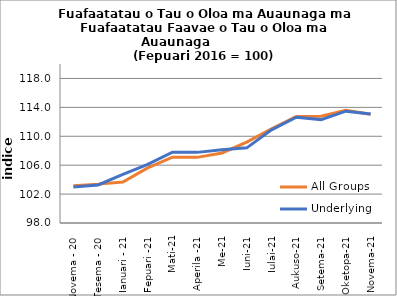
| Category | All Groups | Underlying |
|---|---|---|
| Novema - 20 | 103.171 | 102.969 |
| Tesema - 20 | 103.378 | 103.266 |
| Ianuari - 21 | 103.671 | 104.733 |
| Fepuari -21 | 105.627 | 106.099 |
| Mati-21 | 107.11 | 107.788 |
| Aperila -21 | 107.082 | 107.772 |
| Me-21 | 107.693 | 108.128 |
| Iuni-21 | 109.193 | 108.399 |
| Iulai-21 | 111.039 | 110.883 |
| Aukuso-21 | 112.735 | 112.633 |
| Setema-21 | 112.778 | 112.306 |
| Oketopa-21 | 113.609 | 113.469 |
| Novema-21 | 113.04 | 113.069 |